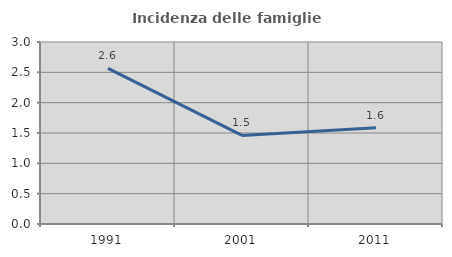
| Category | Incidenza delle famiglie numerose |
|---|---|
| 1991.0 | 2.564 |
| 2001.0 | 1.46 |
| 2011.0 | 1.587 |